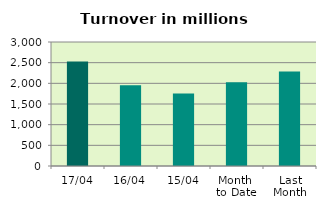
| Category | Series 0 |
|---|---|
| 17/04 | 2528.892 |
| 16/04 | 1953.704 |
| 15/04 | 1751.988 |
| Month 
to Date | 2025.83 |
| Last
Month | 2286.259 |